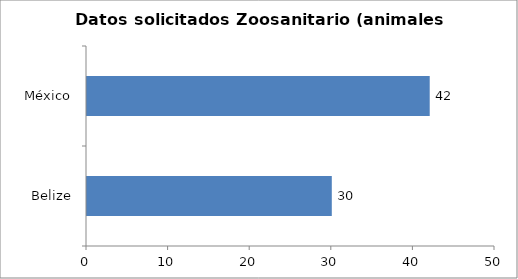
| Category | Series 0 |
|---|---|
| Belize | 30 |
| México | 42 |